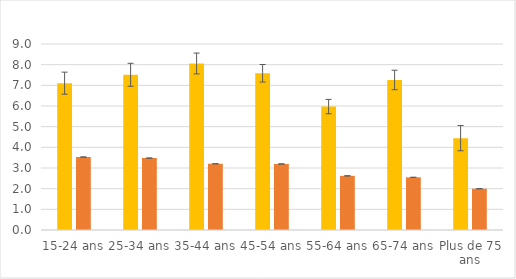
| Category | Hommes | Femmes |
|---|---|---|
| 15-24 ans | 7.105 | 3.53 |
| 25-34 ans | 7.511 | 3.479 |
| 35-44 ans | 8.057 | 3.205 |
| 45-54 ans | 7.584 | 3.196 |
| 55-64 ans | 5.972 | 2.62 |
| 65-74 ans | 7.26 | 2.549 |
| Plus de 75 ans | 4.445 | 1.999 |